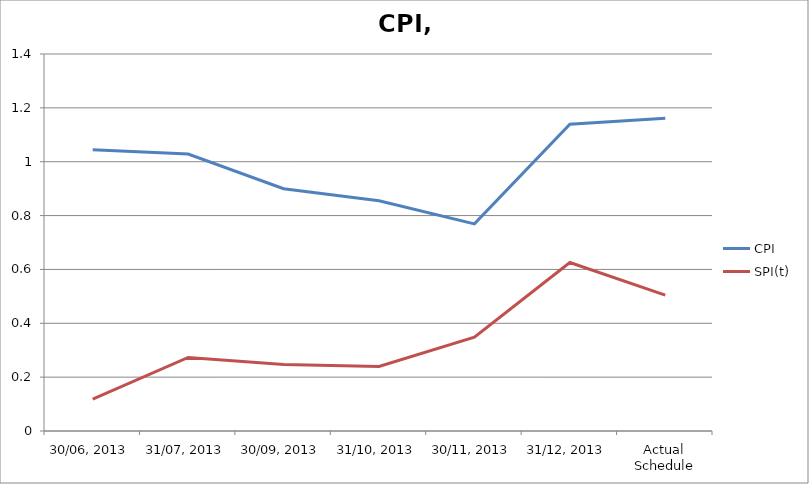
| Category | CPI | SPI(t) |
|---|---|---|
| 30/06, 2013 | 1.044 | 0.118 |
| 31/07, 2013 | 1.029 | 0.273 |
| 30/09, 2013 | 0.9 | 0.247 |
| 31/10, 2013 | 0.855 | 0.24 |
| 30/11, 2013 | 0.769 | 0.348 |
| 31/12, 2013 | 1.139 | 0.626 |
| Actual Schedule | 1.161 | 0.504 |